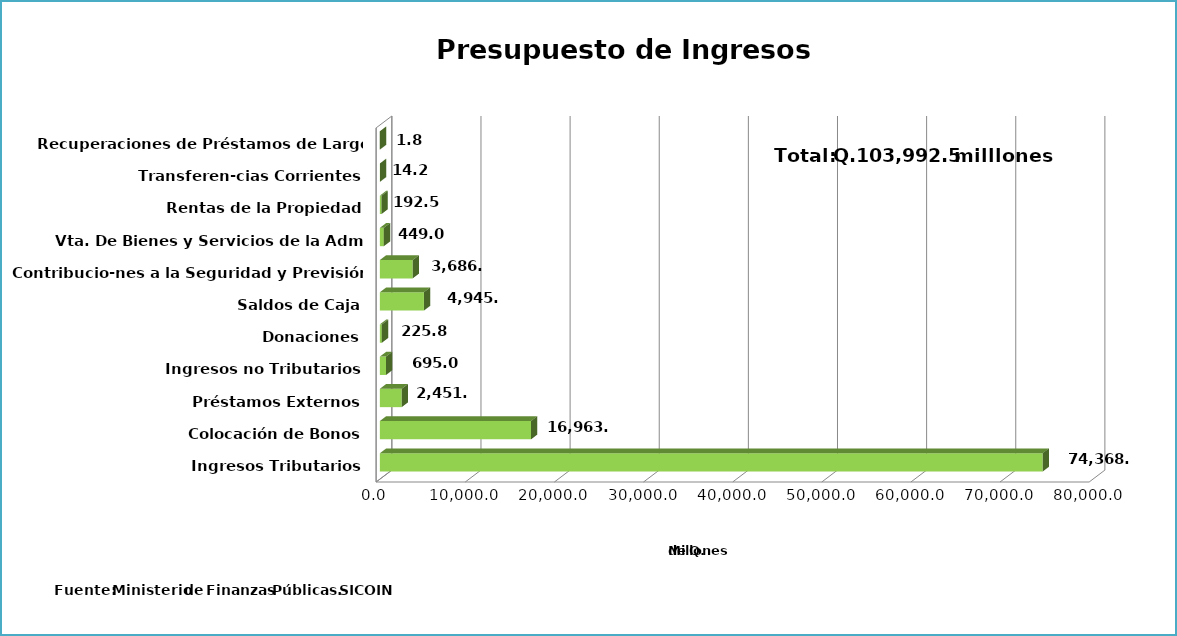
| Category | Series 0 |
|---|---|
| Ingresos Tributarios | 74368 |
| Colocación de Bonos | 16963.1 |
| Préstamos Externos | 2451.5 |
| Ingresos no Tributarios | 695 |
| Donaciones | 225.8 |
| Saldos de Caja | 4945.3 |
| Contribucio-nes a la Seguridad y Previsión Social  | 3686.3 |
| Vta. De Bienes y Servicios de la Adm. Pública | 449 |
| Rentas de la Propiedad | 192.5 |
| Transferen-cias Corrientes | 14.2 |
| Recuperaciones de Préstamos de Largo Plazo | 1.8 |